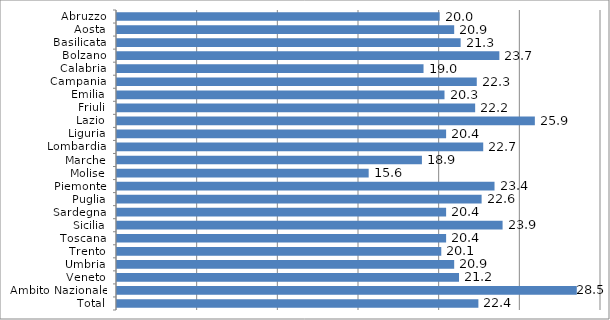
| Category | Series 0 |
|---|---|
| Abruzzo | 20 |
| Aosta | 20.9 |
| Basilicata | 21.3 |
| Bolzano | 23.7 |
| Calabria | 19 |
| Campania | 22.3 |
| Emilia | 20.3 |
| Friuli | 22.2 |
| Lazio | 25.9 |
| Liguria | 20.4 |
| Lombardia | 22.7 |
| Marche | 18.9 |
| Molise | 15.6 |
| Piemonte | 23.4 |
| Puglia | 22.6 |
| Sardegna | 20.4 |
| Sicilia | 23.9 |
| Toscana | 20.4 |
| Trento | 20.1 |
| Umbria | 20.9 |
| Veneto | 21.2 |
| Ambito Nazionale | 28.5 |
| Total | 22.4 |